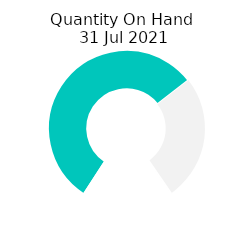
| Category | Quantity On Hand 
31 Jul 2021 |
|---|---|
| 0 | 88.453 |
| 1 | 41.547 |
| 2 | 30 |